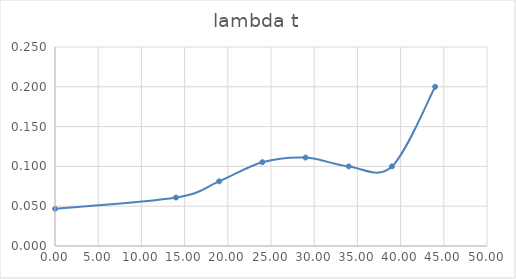
| Category | lambda t |
|---|---|
| 0.0 | 0.047 |
| 14.0 | 0.061 |
| 19.0 | 0.081 |
| 24.0 | 0.105 |
| 29.0 | 0.111 |
| 34.0 | 0.1 |
| 39.0 | 0.1 |
| 44.0 | 0.2 |